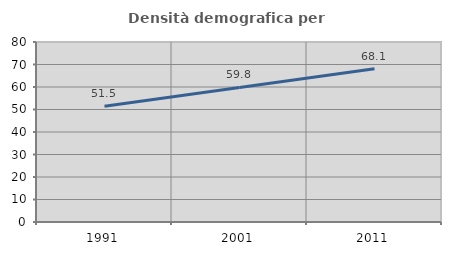
| Category | Densità demografica |
|---|---|
| 1991.0 | 51.454 |
| 2001.0 | 59.799 |
| 2011.0 | 68.097 |